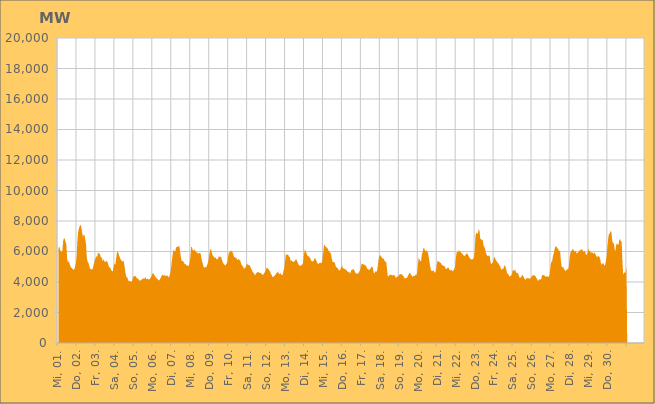
| Category | Series 0 |
|---|---|
|  Mi, 01.  | 6172.682 |
|  Mi, 01.  | 6337.879 |
|  Mi, 01.  | 6150.082 |
|  Mi, 01.  | 6007.373 |
|  Mi, 01.  | 5976.167 |
|  Mi, 01.  | 6039.689 |
|  Mi, 01.  | 6672.344 |
|  Mi, 01.  | 6870.667 |
|  Mi, 01.  | 6852.677 |
|  Mi, 01.  | 6627.141 |
|  Mi, 01.  | 6533.216 |
|  Mi, 01.  | 5536.967 |
|  Mi, 01.  | 5300.69 |
|  Mi, 01.  | 5356.391 |
|  Mi, 01.  | 5228.598 |
|  Mi, 01.  | 5059.918 |
|  Mi, 01.  | 4953.016 |
|  Do, 02.  | 4913.423 |
|  Do, 02.  | 4859.788 |
|  Do, 02.  | 4806.227 |
|  Do, 02.  | 4826.682 |
|  Do, 02.  | 4975.222 |
|  Do, 02.  | 5189.762 |
|  Do, 02.  | 5627.188 |
|  Do, 02.  | 6630.505 |
|  Do, 02.  | 7300.471 |
|  Do, 02.  | 7511.054 |
|  Do, 02.  | 7667.2 |
|  Do, 02.  | 7772.137 |
|  Do, 02.  | 7582.947 |
|  Do, 02.  | 7265.445 |
|  Do, 02.  | 6962.173 |
|  Do, 02.  | 7097.012 |
|  Do, 02.  | 7088.686 |
|  Do, 02.  | 6804.96 |
|  Do, 02.  | 6444.373 |
|  Do, 02.  | 5580.673 |
|  Do, 02.  | 5322.474 |
|  Do, 02.  | 5265.196 |
|  Do, 02.  | 5081.095 |
|  Do, 02.  | 4863.255 |
|  Fr, 03.  | 4852.136 |
|  Fr, 03.  | 4835.485 |
|  Fr, 03.  | 4809.895 |
|  Fr, 03.  | 5002.987 |
|  Fr, 03.  | 5209.97 |
|  Fr, 03.  | 5396.558 |
|  Fr, 03.  | 5548.291 |
|  Fr, 03.  | 5722.998 |
|  Fr, 03.  | 5587.219 |
|  Fr, 03.  | 5942.198 |
|  Fr, 03.  | 5874.687 |
|  Fr, 03.  | 5874.79 |
|  Fr, 03.  | 5766.446 |
|  Fr, 03.  | 5570.169 |
|  Fr, 03.  | 5634.201 |
|  Fr, 03.  | 5353.598 |
|  Fr, 03.  | 5503.029 |
|  Fr, 03.  | 5370.4 |
|  Fr, 03.  | 5324.256 |
|  Fr, 03.  | 5334.42 |
|  Fr, 03.  | 5375.594 |
|  Fr, 03.  | 5334.863 |
|  Fr, 03.  | 5166.875 |
|  Fr, 03.  | 4980.111 |
|  Sa, 04.  | 4960.728 |
|  Sa, 04.  | 4887.158 |
|  Sa, 04.  | 4784.475 |
|  Sa, 04.  | 4688.569 |
|  Sa, 04.  | 4727.192 |
|  Sa, 04.  | 5043.744 |
|  Sa, 04.  | 5222.73 |
|  Sa, 04.  | 5103.318 |
|  Sa, 04.  | 5536.197 |
|  Sa, 04.  | 5901.321 |
|  Sa, 04.  | 5999.454 |
|  Sa, 04.  | 5895.541 |
|  Sa, 04.  | 5700.048 |
|  Sa, 04.  | 5602.442 |
|  Sa, 04.  | 5447.116 |
|  Sa, 04.  | 5412.744 |
|  Sa, 04.  | 5339.298 |
|  Sa, 04.  | 5372.841 |
|  Sa, 04.  | 5313.547 |
|  Sa, 04.  | 4918.852 |
|  Sa, 04.  | 4560.225 |
|  Sa, 04.  | 4351.672 |
|  Sa, 04.  | 4304.486 |
|  Sa, 04.  | 4178.225 |
|  So, 05.  | 4042.404 |
|  So, 05.  | 4053.376 |
|  So, 05.  | 4069.102 |
|  So, 05.  | 3978.624 |
|  So, 05.  | 4059.766 |
|  So, 05.  | 4187.328 |
|  So, 05.  | 4340.82 |
|  So, 05.  | 4395.715 |
|  So, 05.  | 4395.134 |
|  So, 05.  | 4359.939 |
|  So, 05.  | 4258.594 |
|  So, 05.  | 4231.376 |
|  So, 05.  | 4234.033 |
|  So, 05.  | 4079.564 |
|  So, 05.  | 4112.926 |
|  So, 05.  | 4100.171 |
|  So, 05.  | 4139.916 |
|  So, 05.  | 4172.884 |
|  So, 05.  | 4255.512 |
|  So, 05.  | 4212.075 |
|  So, 05.  | 4205.773 |
|  So, 05.  | 4336.318 |
|  So, 05.  | 4203.439 |
|  So, 05.  | 4178.107 |
|  Mo, 06.  | 4235.786 |
|  Mo, 06.  | 4163.726 |
|  Mo, 06.  | 4167.55 |
|  Mo, 06.  | 4225.567 |
|  Mo, 06.  | 4309.659 |
|  Mo, 06.  | 4387.502 |
|  Mo, 06.  | 4546.578 |
|  Mo, 06.  | 4576.032 |
|  Mo, 06.  | 4497.453 |
|  Mo, 06.  | 4374.392 |
|  Mo, 06.  | 4342.969 |
|  Mo, 06.  | 4256.161 |
|  Mo, 06.  | 4208.244 |
|  Mo, 06.  | 4174.3 |
|  Mo, 06.  | 4090.008 |
|  Mo, 06.  | 4132.362 |
|  Mo, 06.  | 4223.089 |
|  Mo, 06.  | 4337.754 |
|  Mo, 06.  | 4422.066 |
|  Mo, 06.  | 4496.786 |
|  Mo, 06.  | 4410.791 |
|  Mo, 06.  | 4446.321 |
|  Mo, 06.  | 4432.815 |
|  Mo, 06.  | 4387.411 |
|  Di, 07.  | 4408.818 |
|  Di, 07.  | 4423.65 |
|  Di, 07.  | 4346.315 |
|  Di, 07.  | 4292.213 |
|  Di, 07.  | 4493.97 |
|  Di, 07.  | 4674.484 |
|  Di, 07.  | 5083.55 |
|  Di, 07.  | 5542.422 |
|  Di, 07.  | 5932.258 |
|  Di, 07.  | 6153.975 |
|  Di, 07.  | 5978.599 |
|  Di, 07.  | 6026.229 |
|  Di, 07.  | 6289.586 |
|  Di, 07.  | 6275.648 |
|  Di, 07.  | 6330.845 |
|  Di, 07.  | 6328.878 |
|  Di, 07.  | 6380.268 |
|  Di, 07.  | 6018.903 |
|  Di, 07.  | 5644.094 |
|  Di, 07.  | 5392.577 |
|  Di, 07.  | 5398.371 |
|  Di, 07.  | 5328.895 |
|  Di, 07.  | 5286.917 |
|  Di, 07.  | 5151.527 |
|  Mi, 08.  | 5192.357 |
|  Mi, 08.  | 5098.828 |
|  Mi, 08.  | 5095.913 |
|  Mi, 08.  | 5017.257 |
|  Mi, 08.  | 5084.176 |
|  Mi, 08.  | 5228.351 |
|  Mi, 08.  | 5580.425 |
|  Mi, 08.  | 6301.28 |
|  Mi, 08.  | 6282.812 |
|  Mi, 08.  | 6080.672 |
|  Mi, 08.  | 6065.342 |
|  Mi, 08.  | 6135.363 |
|  Mi, 08.  | 6060.504 |
|  Mi, 08.  | 6007.75 |
|  Mi, 08.  | 5940.416 |
|  Mi, 08.  | 5890.586 |
|  Mi, 08.  | 5867.999 |
|  Mi, 08.  | 5896.124 |
|  Mi, 08.  | 5899.188 |
|  Mi, 08.  | 5878.823 |
|  Mi, 08.  | 5575.411 |
|  Mi, 08.  | 5319.84 |
|  Mi, 08.  | 5151.824 |
|  Mi, 08.  | 4968.006 |
|  Do, 09.  | 4946.272 |
|  Do, 09.  | 4979.982 |
|  Do, 09.  | 4951.248 |
|  Do, 09.  | 5071.319 |
|  Do, 09.  | 5224.188 |
|  Do, 09.  | 5415.332 |
|  Do, 09.  | 5776.051 |
|  Do, 09.  | 6126.584 |
|  Do, 09.  | 6125.221 |
|  Do, 09.  | 6003.511 |
|  Do, 09.  | 5764.574 |
|  Do, 09.  | 5728.489 |
|  Do, 09.  | 5609.518 |
|  Do, 09.  | 5614.891 |
|  Do, 09.  | 5610.743 |
|  Do, 09.  | 5500.185 |
|  Do, 09.  | 5477.122 |
|  Do, 09.  | 5529.75 |
|  Do, 09.  | 5682.702 |
|  Do, 09.  | 5645.39 |
|  Do, 09.  | 5670.886 |
|  Do, 09.  | 5622.159 |
|  Do, 09.  | 5449.782 |
|  Do, 09.  | 5286.075 |
|  Fr, 10.  | 5202.854 |
|  Fr, 10.  | 5158.986 |
|  Fr, 10.  | 5077.232 |
|  Fr, 10.  | 5125.076 |
|  Fr, 10.  | 5224.831 |
|  Fr, 10.  | 5327.701 |
|  Fr, 10.  | 5708.982 |
|  Fr, 10.  | 6007.963 |
|  Fr, 10.  | 5911.573 |
|  Fr, 10.  | 6046.871 |
|  Fr, 10.  | 6059.719 |
|  Fr, 10.  | 5961.523 |
|  Fr, 10.  | 5906.457 |
|  Fr, 10.  | 5676.49 |
|  Fr, 10.  | 5634.992 |
|  Fr, 10.  | 5592.812 |
|  Fr, 10.  | 5598.171 |
|  Fr, 10.  | 5506.49 |
|  Fr, 10.  | 5431.683 |
|  Fr, 10.  | 5523.286 |
|  Fr, 10.  | 5445.523 |
|  Fr, 10.  | 5426.771 |
|  Fr, 10.  | 5252.636 |
|  Fr, 10.  | 5102.996 |
|  Sa, 11.  | 5078.146 |
|  Sa, 11.  | 4980.711 |
|  Sa, 11.  | 4844.489 |
|  Sa, 11.  | 4925.009 |
|  Sa, 11.  | 4972.696 |
|  Sa, 11.  | 5130.342 |
|  Sa, 11.  | 5182.705 |
|  Sa, 11.  | 5130.046 |
|  Sa, 11.  | 5106.202 |
|  Sa, 11.  | 5098.85 |
|  Sa, 11.  | 5006.699 |
|  Sa, 11.  | 4858.781 |
|  Sa, 11.  | 4801.905 |
|  Sa, 11.  | 4626.1 |
|  Sa, 11.  | 4615.348 |
|  Sa, 11.  | 4509.959 |
|  Sa, 11.  | 4429.472 |
|  Sa, 11.  | 4559.286 |
|  Sa, 11.  | 4586.693 |
|  Sa, 11.  | 4661.223 |
|  Sa, 11.  | 4649.917 |
|  Sa, 11.  | 4620.127 |
|  Sa, 11.  | 4588.794 |
|  Sa, 11.  | 4613.855 |
|  So, 12.  | 4548.979 |
|  So, 12.  | 4484.308 |
|  So, 12.  | 4467.319 |
|  So, 12.  | 4546.826 |
|  So, 12.  | 4625.849 |
|  So, 12.  | 4685.57 |
|  So, 12.  | 4895.883 |
|  So, 12.  | 4900.379 |
|  So, 12.  | 4907.337 |
|  So, 12.  | 4837.016 |
|  So, 12.  | 4743.535 |
|  So, 12.  | 4682.816 |
|  So, 12.  | 4540.741 |
|  So, 12.  | 4450.846 |
|  So, 12.  | 4323.304 |
|  So, 12.  | 4329.444 |
|  So, 12.  | 4403.667 |
|  So, 12.  | 4418.279 |
|  So, 12.  | 4494.927 |
|  So, 12.  | 4591.881 |
|  So, 12.  | 4606.879 |
|  So, 12.  | 4705.145 |
|  So, 12.  | 4554.025 |
|  So, 12.  | 4502.116 |
|  Mo, 13.  | 4600.727 |
|  Mo, 13.  | 4480.136 |
|  Mo, 13.  | 4428.322 |
|  Mo, 13.  | 4498.568 |
|  Mo, 13.  | 4765.182 |
|  Mo, 13.  | 4920.23 |
|  Mo, 13.  | 5387.703 |
|  Mo, 13.  | 5832.261 |
|  Mo, 13.  | 5785.171 |
|  Mo, 13.  | 5800.886 |
|  Mo, 13.  | 5765.769 |
|  Mo, 13.  | 5652.894 |
|  Mo, 13.  | 5629.36 |
|  Mo, 13.  | 5382.999 |
|  Mo, 13.  | 5422.408 |
|  Mo, 13.  | 5345.952 |
|  Mo, 13.  | 5334.021 |
|  Mo, 13.  | 5327.836 |
|  Mo, 13.  | 5361.308 |
|  Mo, 13.  | 5452.799 |
|  Mo, 13.  | 5493.244 |
|  Mo, 13.  | 5390.112 |
|  Mo, 13.  | 5265.433 |
|  Mo, 13.  | 5126.86 |
|  Di, 14.  | 5102.81 |
|  Di, 14.  | 5039.863 |
|  Di, 14.  | 5075.93 |
|  Di, 14.  | 5131.273 |
|  Di, 14.  | 5141.602 |
|  Di, 14.  | 5362.712 |
|  Di, 14.  | 5843.495 |
|  Di, 14.  | 6127.433 |
|  Di, 14.  | 6021.305 |
|  Di, 14.  | 5899.316 |
|  Di, 14.  | 5744.83 |
|  Di, 14.  | 5689.442 |
|  Di, 14.  | 5670.215 |
|  Di, 14.  | 5615.871 |
|  Di, 14.  | 5534.345 |
|  Di, 14.  | 5396.687 |
|  Di, 14.  | 5351.619 |
|  Di, 14.  | 5354.652 |
|  Di, 14.  | 5384.467 |
|  Di, 14.  | 5529.102 |
|  Di, 14.  | 5569.609 |
|  Di, 14.  | 5437.837 |
|  Di, 14.  | 5343.128 |
|  Di, 14.  | 5209.62 |
|  Mi, 15.  | 5182.341 |
|  Mi, 15.  | 5232.149 |
|  Mi, 15.  | 5252.211 |
|  Mi, 15.  | 5266.911 |
|  Mi, 15.  | 5209.247 |
|  Mi, 15.  | 5362.291 |
|  Mi, 15.  | 5795.206 |
|  Mi, 15.  | 6348.662 |
|  Mi, 15.  | 6476.402 |
|  Mi, 15.  | 6331.311 |
|  Mi, 15.  | 6280.962 |
|  Mi, 15.  | 6259.024 |
|  Mi, 15.  | 6170.625 |
|  Mi, 15.  | 6054.103 |
|  Mi, 15.  | 5998.759 |
|  Mi, 15.  | 5910.938 |
|  Mi, 15.  | 5870.44 |
|  Mi, 15.  | 5544.267 |
|  Mi, 15.  | 5324.389 |
|  Mi, 15.  | 5301.145 |
|  Mi, 15.  | 5318.976 |
|  Mi, 15.  | 5220.313 |
|  Mi, 15.  | 5049.03 |
|  Mi, 15.  | 4954.711 |
|  Do, 16.  | 4941.171 |
|  Do, 16.  | 4860.43 |
|  Do, 16.  | 4774.38 |
|  Do, 16.  | 4742.868 |
|  Do, 16.  | 4832.499 |
|  Do, 16.  | 4959.81 |
|  Do, 16.  | 5103.814 |
|  Do, 16.  | 4914.696 |
|  Do, 16.  | 4899.743 |
|  Do, 16.  | 4860.188 |
|  Do, 16.  | 4810.971 |
|  Do, 16.  | 4818.341 |
|  Do, 16.  | 4740.78 |
|  Do, 16.  | 4691.782 |
|  Do, 16.  | 4617.386 |
|  Do, 16.  | 4704.646 |
|  Do, 16.  | 4561.29 |
|  Do, 16.  | 4628.73 |
|  Do, 16.  | 4808.055 |
|  Do, 16.  | 4795.615 |
|  Do, 16.  | 4847.969 |
|  Do, 16.  | 4808.965 |
|  Do, 16.  | 4714.98 |
|  Do, 16.  | 4591.327 |
|  Fr, 17.  | 4532.73 |
|  Fr, 17.  | 4567.441 |
|  Fr, 17.  | 4550.805 |
|  Fr, 17.  | 4594.781 |
|  Fr, 17.  | 4687.511 |
|  Fr, 17.  | 4790.909 |
|  Fr, 17.  | 5033.761 |
|  Fr, 17.  | 5213.953 |
|  Fr, 17.  | 5178.87 |
|  Fr, 17.  | 5125.505 |
|  Fr, 17.  | 5173.818 |
|  Fr, 17.  | 5086.217 |
|  Fr, 17.  | 5080.244 |
|  Fr, 17.  | 4982.305 |
|  Fr, 17.  | 4866.649 |
|  Fr, 17.  | 4836.024 |
|  Fr, 17.  | 4807.762 |
|  Fr, 17.  | 4804.759 |
|  Fr, 17.  | 4883.696 |
|  Fr, 17.  | 4985.264 |
|  Fr, 17.  | 5001.195 |
|  Fr, 17.  | 4930.44 |
|  Fr, 17.  | 4640.128 |
|  Fr, 17.  | 4559.246 |
|  Sa, 18.  | 4674.101 |
|  Sa, 18.  | 4723.15 |
|  Sa, 18.  | 4657.158 |
|  Sa, 18.  | 4931.844 |
|  Sa, 18.  | 5359.628 |
|  Sa, 18.  | 5669.289 |
|  Sa, 18.  | 5788.04 |
|  Sa, 18.  | 5700.623 |
|  Sa, 18.  | 5637.888 |
|  Sa, 18.  | 5549.834 |
|  Sa, 18.  | 5543.579 |
|  Sa, 18.  | 5504.288 |
|  Sa, 18.  | 5373.289 |
|  Sa, 18.  | 5322.695 |
|  Sa, 18.  | 5321.305 |
|  Sa, 18.  | 4819.146 |
|  Sa, 18.  | 4352.639 |
|  Sa, 18.  | 4386.251 |
|  Sa, 18.  | 4445.939 |
|  Sa, 18.  | 4495.639 |
|  Sa, 18.  | 4460.3 |
|  Sa, 18.  | 4459.987 |
|  Sa, 18.  | 4415.66 |
|  Sa, 18.  | 4463.818 |
|  So, 19.  | 4449.143 |
|  So, 19.  | 4408.497 |
|  So, 19.  | 4283.313 |
|  So, 19.  | 4296.675 |
|  So, 19.  | 4373.243 |
|  So, 19.  | 4333.331 |
|  So, 19.  | 4477.466 |
|  So, 19.  | 4475.57 |
|  So, 19.  | 4510.6 |
|  So, 19.  | 4520.99 |
|  So, 19.  | 4493.996 |
|  So, 19.  | 4414.471 |
|  So, 19.  | 4370.67 |
|  So, 19.  | 4246.586 |
|  So, 19.  | 4218.07 |
|  So, 19.  | 4264.98 |
|  So, 19.  | 4268.316 |
|  So, 19.  | 4356.451 |
|  So, 19.  | 4459.226 |
|  So, 19.  | 4555.246 |
|  So, 19.  | 4612.867 |
|  So, 19.  | 4500.22 |
|  So, 19.  | 4437.822 |
|  So, 19.  | 4342.107 |
|  Mo, 20.  | 4379.269 |
|  Mo, 20.  | 4413.873 |
|  Mo, 20.  | 4391.563 |
|  Mo, 20.  | 4479.152 |
|  Mo, 20.  | 4449.038 |
|  Mo, 20.  | 4588.439 |
|  Mo, 20.  | 5076.236 |
|  Mo, 20.  | 5572.514 |
|  Mo, 20.  | 5496.61 |
|  Mo, 20.  | 5364.931 |
|  Mo, 20.  | 5374.164 |
|  Mo, 20.  | 5774.174 |
|  Mo, 20.  | 5957.72 |
|  Mo, 20.  | 6210.825 |
|  Mo, 20.  | 6206.565 |
|  Mo, 20.  | 6079.245 |
|  Mo, 20.  | 6014.97 |
|  Mo, 20.  | 6076.1 |
|  Mo, 20.  | 6019.431 |
|  Mo, 20.  | 5844.295 |
|  Mo, 20.  | 5562.697 |
|  Mo, 20.  | 5212.944 |
|  Mo, 20.  | 4906.269 |
|  Mo, 20.  | 4736.247 |
|  Di, 21.  | 4710.695 |
|  Di, 21.  | 4737.442 |
|  Di, 21.  | 4752.498 |
|  Di, 21.  | 4627.938 |
|  Di, 21.  | 4613.38 |
|  Di, 21.  | 4774.091 |
|  Di, 21.  | 5151.127 |
|  Di, 21.  | 5411.756 |
|  Di, 21.  | 5354.206 |
|  Di, 21.  | 5318.133 |
|  Di, 21.  | 5263.49 |
|  Di, 21.  | 5254.666 |
|  Di, 21.  | 5153.306 |
|  Di, 21.  | 5105.401 |
|  Di, 21.  | 5063.958 |
|  Di, 21.  | 5073.416 |
|  Di, 21.  | 5000.507 |
|  Di, 21.  | 4899.546 |
|  Di, 21.  | 4840.859 |
|  Di, 21.  | 4884.051 |
|  Di, 21.  | 4966.464 |
|  Di, 21.  | 4907.273 |
|  Di, 21.  | 4809.816 |
|  Di, 21.  | 4749.816 |
|  Mi, 22.  | 4796.499 |
|  Mi, 22.  | 4777.519 |
|  Mi, 22.  | 4695.134 |
|  Mi, 22.  | 4749.967 |
|  Mi, 22.  | 4850.353 |
|  Mi, 22.  | 4994.997 |
|  Mi, 22.  | 5531.133 |
|  Mi, 22.  | 5928.111 |
|  Mi, 22.  | 5978.87 |
|  Mi, 22.  | 5951.287 |
|  Mi, 22.  | 6112.936 |
|  Mi, 22.  | 5970.664 |
|  Mi, 22.  | 5987.972 |
|  Mi, 22.  | 5888.968 |
|  Mi, 22.  | 5880.846 |
|  Mi, 22.  | 5791.458 |
|  Mi, 22.  | 5736.679 |
|  Mi, 22.  | 5690.918 |
|  Mi, 22.  | 5768.08 |
|  Mi, 22.  | 5805.993 |
|  Mi, 22.  | 5886.146 |
|  Mi, 22.  | 5832.451 |
|  Mi, 22.  | 5730.705 |
|  Mi, 22.  | 5621.391 |
|  Do, 23.  | 5547.531 |
|  Do, 23.  | 5490.671 |
|  Do, 23.  | 5473.921 |
|  Do, 23.  | 5486.18 |
|  Do, 23.  | 5517.922 |
|  Do, 23.  | 5617.388 |
|  Do, 23.  | 6139.373 |
|  Do, 23.  | 7036.114 |
|  Do, 23.  | 7246.444 |
|  Do, 23.  | 7150.198 |
|  Do, 23.  | 7218.916 |
|  Do, 23.  | 7454.547 |
|  Do, 23.  | 7362.525 |
|  Do, 23.  | 6839.073 |
|  Do, 23.  | 6806.582 |
|  Do, 23.  | 6741.653 |
|  Do, 23.  | 6778.151 |
|  Do, 23.  | 6423.945 |
|  Do, 23.  | 6296.044 |
|  Do, 23.  | 6198.537 |
|  Do, 23.  | 5913.747 |
|  Do, 23.  | 5786.879 |
|  Do, 23.  | 5718.965 |
|  Do, 23.  | 5680.407 |
|  Fr, 24.  | 5755.899 |
|  Fr, 24.  | 5697.08 |
|  Fr, 24.  | 5278.221 |
|  Fr, 24.  | 5167.616 |
|  Fr, 24.  | 5226.157 |
|  Fr, 24.  | 5283.75 |
|  Fr, 24.  | 5529.784 |
|  Fr, 24.  | 5656.596 |
|  Fr, 24.  | 5514.593 |
|  Fr, 24.  | 5410.769 |
|  Fr, 24.  | 5333.674 |
|  Fr, 24.  | 5261.091 |
|  Fr, 24.  | 5220.14 |
|  Fr, 24.  | 5104.07 |
|  Fr, 24.  | 5055.985 |
|  Fr, 24.  | 4894.875 |
|  Fr, 24.  | 4784.612 |
|  Fr, 24.  | 4870.359 |
|  Fr, 24.  | 4845.687 |
|  Fr, 24.  | 5017.356 |
|  Fr, 24.  | 5124.415 |
|  Fr, 24.  | 4942.425 |
|  Fr, 24.  | 4791.014 |
|  Fr, 24.  | 4569.606 |
|  Sa, 25.  | 4541.662 |
|  Sa, 25.  | 4450.395 |
|  Sa, 25.  | 4361.893 |
|  Sa, 25.  | 4398.087 |
|  Sa, 25.  | 4415.197 |
|  Sa, 25.  | 4510.763 |
|  Sa, 25.  | 4768.428 |
|  Sa, 25.  | 4774.501 |
|  Sa, 25.  | 4710.861 |
|  Sa, 25.  | 4832.57 |
|  Sa, 25.  | 4681.588 |
|  Sa, 25.  | 4577.006 |
|  Sa, 25.  | 4611.332 |
|  Sa, 25.  | 4526.457 |
|  Sa, 25.  | 4402.616 |
|  Sa, 25.  | 4257.705 |
|  Sa, 25.  | 4299.001 |
|  Sa, 25.  | 4348.497 |
|  Sa, 25.  | 4494.529 |
|  Sa, 25.  | 4401.913 |
|  Sa, 25.  | 4314.758 |
|  Sa, 25.  | 4205.87 |
|  Sa, 25.  | 4160.247 |
|  Sa, 25.  | 4182.257 |
|  So, 26.  | 4300.468 |
|  So, 26.  | 4231.863 |
|  So, 26.  | 4241.671 |
|  So, 26.  | 4254.98 |
|  So, 26.  | 4208.249 |
|  So, 26.  | 4270.971 |
|  So, 26.  | 4359.064 |
|  So, 26.  | 4438.42 |
|  So, 26.  | 4410.963 |
|  So, 26.  | 4495.48 |
|  So, 26.  | 4387.576 |
|  So, 26.  | 4382.282 |
|  So, 26.  | 4256.839 |
|  So, 26.  | 4189.99 |
|  So, 26.  | 4074.322 |
|  So, 26.  | 4117.17 |
|  So, 26.  | 4198.817 |
|  So, 26.  | 4150.957 |
|  So, 26.  | 4179.935 |
|  So, 26.  | 4413.202 |
|  So, 26.  | 4464.273 |
|  So, 26.  | 4453.111 |
|  So, 26.  | 4429.95 |
|  So, 26.  | 4397.937 |
|  Mo, 27.  | 4318.854 |
|  Mo, 27.  | 4380.524 |
|  Mo, 27.  | 4363.044 |
|  Mo, 27.  | 4335.529 |
|  Mo, 27.  | 4355.326 |
|  Mo, 27.  | 4568.344 |
|  Mo, 27.  | 5077.365 |
|  Mo, 27.  | 5329.006 |
|  Mo, 27.  | 5359.525 |
|  Mo, 27.  | 5709.724 |
|  Mo, 27.  | 5852.568 |
|  Mo, 27.  | 6132.311 |
|  Mo, 27.  | 6326.132 |
|  Mo, 27.  | 6321.688 |
|  Mo, 27.  | 6281.853 |
|  Mo, 27.  | 6189.106 |
|  Mo, 27.  | 6105.824 |
|  Mo, 27.  | 6007.667 |
|  Mo, 27.  | 6082.914 |
|  Mo, 27.  | 5404.958 |
|  Mo, 27.  | 5002.139 |
|  Mo, 27.  | 4958.264 |
|  Mo, 27.  | 4993.78 |
|  Mo, 27.  | 4813.615 |
|  Di, 28.  | 4803.731 |
|  Di, 28.  | 4693.815 |
|  Di, 28.  | 4787.887 |
|  Di, 28.  | 4845.949 |
|  Di, 28.  | 4830.321 |
|  Di, 28.  | 4969.87 |
|  Di, 28.  | 5543.167 |
|  Di, 28.  | 5881.84 |
|  Di, 28.  | 6055.217 |
|  Di, 28.  | 6057.89 |
|  Di, 28.  | 6176.622 |
|  Di, 28.  | 6112.962 |
|  Di, 28.  | 5999.885 |
|  Di, 28.  | 6020.561 |
|  Di, 28.  | 6026.184 |
|  Di, 28.  | 5858.565 |
|  Di, 28.  | 5890.221 |
|  Di, 28.  | 5976.222 |
|  Di, 28.  | 5999.1 |
|  Di, 28.  | 6081.296 |
|  Di, 28.  | 6123.754 |
|  Di, 28.  | 6103.278 |
|  Di, 28.  | 6178.084 |
|  Di, 28.  | 5991.893 |
|  Mi, 29.  | 6006.998 |
|  Mi, 29.  | 6043.623 |
|  Mi, 29.  | 5939.584 |
|  Mi, 29.  | 5753.743 |
|  Mi, 29.  | 5824.094 |
|  Mi, 29.  | 5932.144 |
|  Mi, 29.  | 6194.765 |
|  Mi, 29.  | 6054.558 |
|  Mi, 29.  | 6010.175 |
|  Mi, 29.  | 5913.922 |
|  Mi, 29.  | 5946.704 |
|  Mi, 29.  | 5940.034 |
|  Mi, 29.  | 5840.643 |
|  Mi, 29.  | 5929.882 |
|  Mi, 29.  | 5896.728 |
|  Mi, 29.  | 5793.931 |
|  Mi, 29.  | 5690.737 |
|  Mi, 29.  | 5643.805 |
|  Mi, 29.  | 5667.581 |
|  Mi, 29.  | 5715.189 |
|  Mi, 29.  | 5625.058 |
|  Mi, 29.  | 5463.836 |
|  Mi, 29.  | 5108.398 |
|  Mi, 29.  | 5240.719 |
|  Do, 30.  | 5197.17 |
|  Do, 30.  | 5238.173 |
|  Do, 30.  | 5062.237 |
|  Do, 30.  | 5104.143 |
|  Do, 30.  | 5383.757 |
|  Do, 30.  | 5730.326 |
|  Do, 30.  | 6405.584 |
|  Do, 30.  | 6901.404 |
|  Do, 30.  | 7174.731 |
|  Do, 30.  | 7171.579 |
|  Do, 30.  | 7367.322 |
|  Do, 30.  | 7263.652 |
|  Do, 30.  | 6766.442 |
|  Do, 30.  | 6501.054 |
|  Do, 30.  | 6577.578 |
|  Do, 30.  | 6172.69 |
|  Do, 30.  | 6006.281 |
|  Do, 30.  | 6428.399 |
|  Do, 30.  | 6547.987 |
|  Do, 30.  | 6437.801 |
|  Do, 30.  | 6443.154 |
|  Do, 30.  | 6800.156 |
|  Do, 30.  | 6784.18 |
|  Do, 30.  | 6674.164 |
|  Fr, 01.  | 6634.813 |
|  Fr, 01.  | 5255.007 |
|  Fr, 01.  | 4448.673 |
|  Fr, 01.  | 4621.125 |
|  Fr, 01.  | 4613.656 |
|  Fr, 01.  | 4627.987 |
|    | 4976.804 |
|    | 0 |
|    | 0 |
|    | 0 |
|    | 0 |
|    | 0 |
|    | 0 |
|    | 0 |
|    | 0 |
|    | 0 |
|    | 0 |
|    | 0 |
|    | 0 |
|    | 0 |
|    | 0 |
|    | 0 |
|    | 0 |
|    | 0 |
|    | 0 |
|    | 0 |
|    | 0 |
|    | 0 |
|    | 0 |
|    | 0 |